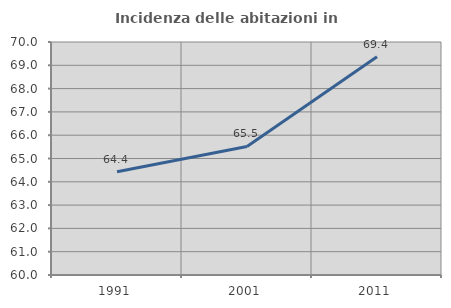
| Category | Incidenza delle abitazioni in proprietà  |
|---|---|
| 1991.0 | 64.433 |
| 2001.0 | 65.517 |
| 2011.0 | 69.363 |